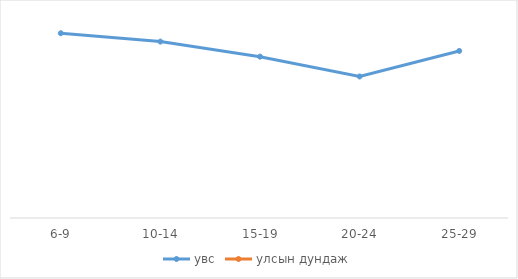
| Category | увс | улсын дундаж |
|---|---|---|
|  6-9 | 106.602 |  |
|  10-14 | 101.765 |  |
|  15-19 | 93.082 |  |
|  20-24 | 81.639 |  |
|  25-29 | 96.386 |  |